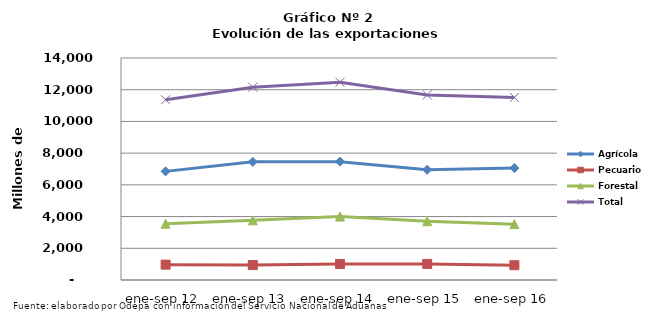
| Category | Agrícola | Pecuario | Forestal | Total |
|---|---|---|---|---|
| ene-sep 12 | 6849765 | 967053 | 3549447 | 11366265 |
| ene-sep 13 | 7452193 | 941268 | 3765902 | 12159363 |
| ene-sep 14 | 7464614 | 1008876 | 4000388 | 12473878 |
| ene-sep 15 | 6950931 | 1013702 | 3706848 | 11671481 |
| ene-sep 16 | 7058554 | 931564 | 3523441 | 11513559 |